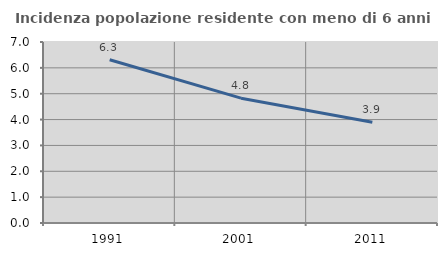
| Category | Incidenza popolazione residente con meno di 6 anni |
|---|---|
| 1991.0 | 6.315 |
| 2001.0 | 4.827 |
| 2011.0 | 3.893 |